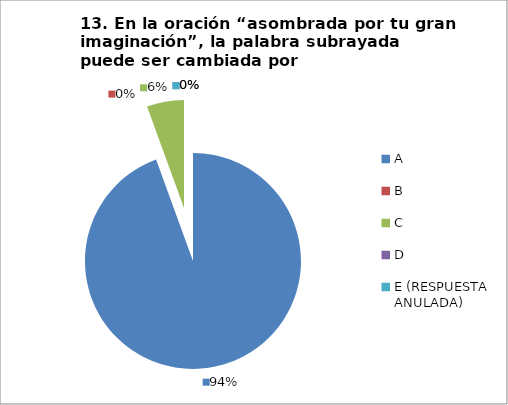
| Category | CANTIDAD DE RESPUESTAS PREGUNTA (13) | PORCENTAJE |
|---|---|---|
| A | 34 | 0.944 |
| B | 0 | 0 |
| C | 2 | 0.056 |
| D | 0 | 0 |
| E (RESPUESTA ANULADA) | 0 | 0 |